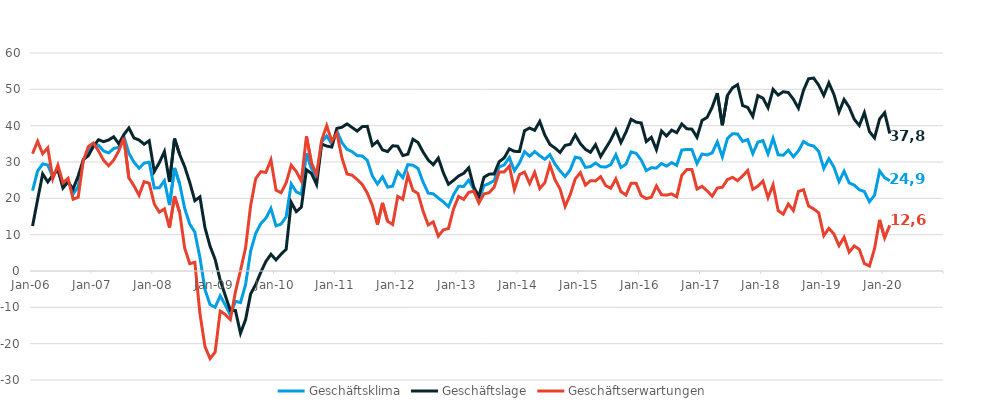
| Category | Geschäftsklima | Geschäftslage | Geschäftserwartungen |
|---|---|---|---|
| 2006-01-01 | 22.11 | 12.37 | 32.3 |
| 2006-02-01 | 27.53 | 19.65 | 35.69 |
| 2006-03-01 | 29.48 | 26.72 | 32.27 |
| 2006-04-01 | 29.16 | 24.52 | 33.9 |
| 2006-05-01 | 25.89 | 26.34 | 25.44 |
| 2006-06-01 | 28.5 | 27.9 | 29.12 |
| 2006-07-01 | 23.55 | 22.83 | 24.27 |
| 2006-08-01 | 25.02 | 24.53 | 25.5 |
| 2006-09-01 | 21.16 | 22.57 | 19.76 |
| 2006-10-01 | 23.19 | 26.13 | 20.29 |
| 2006-11-01 | 30.47 | 30.63 | 30.31 |
| 2006-12-01 | 33 | 31.75 | 34.25 |
| 2007-01-01 | 34.75 | 34.28 | 35.22 |
| 2007-02-01 | 34.59 | 36.13 | 33.07 |
| 2007-03-01 | 33.04 | 35.6 | 30.5 |
| 2007-04-01 | 32.49 | 36.05 | 28.98 |
| 2007-05-01 | 33.71 | 36.94 | 30.52 |
| 2007-06-01 | 34.04 | 35.02 | 33.06 |
| 2007-07-01 | 37.09 | 37.54 | 36.64 |
| 2007-08-01 | 32.38 | 39.37 | 25.6 |
| 2007-09-01 | 29.94 | 36.62 | 23.45 |
| 2007-10-01 | 28.31 | 36.05 | 20.83 |
| 2007-11-01 | 29.69 | 34.91 | 24.58 |
| 2007-12-01 | 29.93 | 35.86 | 24.15 |
| 2008-01-01 | 22.86 | 27.38 | 18.44 |
| 2008-02-01 | 22.9 | 29.82 | 16.19 |
| 2008-03-01 | 24.85 | 32.88 | 17.11 |
| 2008-04-01 | 18.14 | 24.52 | 11.94 |
| 2008-05-01 | 28.37 | 36.43 | 20.59 |
| 2008-06-01 | 23.98 | 32.09 | 16.15 |
| 2008-07-01 | 17.2 | 28.7 | 6.28 |
| 2008-08-01 | 12.89 | 24.35 | 2.01 |
| 2008-09-01 | 10.7 | 19.34 | 2.39 |
| 2008-10-01 | 3.72 | 20.4 | -11.7 |
| 2008-11-01 | -5.14 | 11.91 | -20.81 |
| 2008-12-01 | -9.26 | 6.82 | -24.1 |
| 2009-01-01 | -9.99 | 3.19 | -22.33 |
| 2009-02-01 | -6.84 | -2.53 | -11.05 |
| 2009-03-01 | -9.36 | -6.73 | -11.95 |
| 2009-04-01 | -12.11 | -10.86 | -13.35 |
| 2009-05-01 | -8.32 | -10.87 | -5.73 |
| 2009-06-01 | -8.7 | -17.14 | 0.14 |
| 2009-07-01 | -3.76 | -13.38 | 6.36 |
| 2009-08-01 | 5.5 | -6.3 | 18.03 |
| 2009-09-01 | 10.37 | -3.7 | 25.43 |
| 2009-10-01 | 13.04 | -0.36 | 27.34 |
| 2009-11-01 | 14.52 | 2.62 | 27.13 |
| 2009-12-01 | 17.21 | 4.6 | 30.59 |
| 2010-01-01 | 12.43 | 3.06 | 22.24 |
| 2010-02-01 | 12.91 | 4.62 | 21.53 |
| 2010-03-01 | 14.92 | 5.98 | 24.24 |
| 2010-04-01 | 23.96 | 18.91 | 29.13 |
| 2010-05-01 | 21.79 | 16.34 | 27.38 |
| 2010-06-01 | 21.13 | 17.58 | 24.73 |
| 2010-07-01 | 32.43 | 27.87 | 37.08 |
| 2010-08-01 | 28.26 | 26.83 | 29.7 |
| 2010-09-01 | 25.23 | 23.82 | 26.65 |
| 2010-10-01 | 35.47 | 34.94 | 36 |
| 2010-11-01 | 37.18 | 34.38 | 40.01 |
| 2010-12-01 | 34.94 | 34.12 | 35.76 |
| 2011-01-01 | 38.57 | 39.24 | 37.89 |
| 2011-02-01 | 35.33 | 39.56 | 31.16 |
| 2011-03-01 | 33.49 | 40.48 | 26.71 |
| 2011-04-01 | 32.85 | 39.51 | 26.36 |
| 2011-05-01 | 31.75 | 38.51 | 25.18 |
| 2011-06-01 | 31.65 | 39.73 | 23.84 |
| 2011-07-01 | 30.45 | 39.81 | 21.46 |
| 2011-08-01 | 26.15 | 34.55 | 18.05 |
| 2011-09-01 | 23.94 | 35.69 | 12.77 |
| 2011-10-01 | 25.92 | 33.33 | 18.75 |
| 2011-11-01 | 23.07 | 32.86 | 13.7 |
| 2011-12-01 | 23.37 | 34.47 | 12.8 |
| 2012-01-01 | 27.33 | 34.34 | 20.53 |
| 2012-02-01 | 25.68 | 31.77 | 19.75 |
| 2012-03-01 | 29.27 | 32.15 | 26.42 |
| 2012-04-01 | 29.13 | 36.28 | 22.19 |
| 2012-05-01 | 28.22 | 35.35 | 21.3 |
| 2012-06-01 | 24.46 | 32.74 | 16.47 |
| 2012-07-01 | 21.45 | 30.58 | 12.68 |
| 2012-08-01 | 21.24 | 29.25 | 13.52 |
| 2012-09-01 | 20.07 | 31.09 | 9.58 |
| 2012-10-01 | 19.03 | 27.01 | 11.34 |
| 2012-11-01 | 17.69 | 23.87 | 11.68 |
| 2012-12-01 | 20.98 | 24.95 | 17.08 |
| 2013-01-01 | 23.31 | 26.15 | 20.51 |
| 2013-02-01 | 23.27 | 26.88 | 19.71 |
| 2013-03-01 | 25.01 | 28.41 | 21.65 |
| 2013-04-01 | 22.51 | 23.04 | 21.98 |
| 2013-05-01 | 19.66 | 20.59 | 18.72 |
| 2013-06-01 | 23.49 | 25.8 | 21.21 |
| 2013-07-01 | 24.08 | 26.65 | 21.55 |
| 2013-08-01 | 24.86 | 26.72 | 23.01 |
| 2013-09-01 | 28.65 | 30.08 | 27.24 |
| 2013-10-01 | 29.2 | 31.14 | 27.27 |
| 2013-11-01 | 31.25 | 33.62 | 28.9 |
| 2013-12-01 | 27.61 | 32.93 | 22.41 |
| 2014-01-01 | 29.71 | 32.9 | 26.57 |
| 2014-02-01 | 32.86 | 38.63 | 27.22 |
| 2014-03-01 | 31.59 | 39.35 | 24.08 |
| 2014-04-01 | 32.87 | 38.73 | 27.15 |
| 2014-05-01 | 31.74 | 41.17 | 22.69 |
| 2014-06-01 | 30.76 | 37.41 | 24.29 |
| 2014-07-01 | 32.03 | 34.84 | 29.25 |
| 2014-08-01 | 29.45 | 33.85 | 25.12 |
| 2014-09-01 | 27.56 | 32.64 | 22.58 |
| 2014-10-01 | 26.01 | 34.57 | 17.77 |
| 2014-11-01 | 27.83 | 34.87 | 21 |
| 2014-12-01 | 31.33 | 37.46 | 25.35 |
| 2015-01-01 | 31.03 | 35.05 | 27.07 |
| 2015-02-01 | 28.51 | 33.49 | 23.63 |
| 2015-03-01 | 28.73 | 32.67 | 24.86 |
| 2015-04-01 | 29.72 | 34.77 | 24.79 |
| 2015-05-01 | 28.72 | 31.51 | 25.97 |
| 2015-06-01 | 28.59 | 33.79 | 23.51 |
| 2015-07-01 | 29.32 | 36.07 | 22.77 |
| 2015-08-01 | 32.01 | 38.87 | 25.35 |
| 2015-09-01 | 28.5 | 35.34 | 21.85 |
| 2015-10-01 | 29.41 | 38.22 | 20.92 |
| 2015-11-01 | 32.78 | 41.75 | 24.15 |
| 2015-12-01 | 32.39 | 40.95 | 24.14 |
| 2016-01-01 | 30.55 | 40.76 | 20.77 |
| 2016-02-01 | 27.64 | 35.63 | 19.92 |
| 2016-03-01 | 28.41 | 36.8 | 20.31 |
| 2016-04-01 | 28.34 | 33.41 | 23.39 |
| 2016-05-01 | 29.59 | 38.53 | 20.98 |
| 2016-06-01 | 28.88 | 37.17 | 20.88 |
| 2016-07-01 | 29.82 | 38.77 | 21.22 |
| 2016-08-01 | 29.07 | 38.06 | 20.42 |
| 2016-09-01 | 33.28 | 40.47 | 26.31 |
| 2016-10-01 | 33.47 | 39.14 | 27.94 |
| 2016-11-01 | 33.41 | 39.04 | 27.92 |
| 2016-12-01 | 29.57 | 36.8 | 22.55 |
| 2017-01-01 | 32.2 | 41.46 | 23.3 |
| 2017-02-01 | 31.93 | 42.27 | 22.04 |
| 2017-03-01 | 32.53 | 45.11 | 20.59 |
| 2017-04-01 | 35.54 | 48.96 | 22.83 |
| 2017-05-01 | 31.43 | 40.13 | 23.05 |
| 2017-06-01 | 36.46 | 48.33 | 25.16 |
| 2017-07-01 | 37.78 | 50.41 | 25.78 |
| 2017-08-01 | 37.71 | 51.29 | 24.87 |
| 2017-09-01 | 35.66 | 45.54 | 26.17 |
| 2017-10-01 | 36.18 | 45.01 | 27.67 |
| 2017-11-01 | 32.32 | 42.57 | 22.5 |
| 2017-12-01 | 35.47 | 48.27 | 23.34 |
| 2018-01-01 | 35.89 | 47.59 | 24.73 |
| 2018-02-01 | 32.23 | 44.94 | 20.19 |
| 2018-03-01 | 36.5 | 49.99 | 23.73 |
| 2018-04-01 | 31.98 | 48.42 | 16.62 |
| 2018-05-01 | 31.88 | 49.34 | 15.64 |
| 2018-06-01 | 33.27 | 49.12 | 18.43 |
| 2018-07-01 | 31.45 | 47.27 | 16.64 |
| 2018-08-01 | 33.07 | 44.81 | 21.9 |
| 2018-09-01 | 35.65 | 49.75 | 22.35 |
| 2018-10-01 | 34.74 | 52.91 | 17.88 |
| 2018-11-01 | 34.41 | 53.11 | 17.09 |
| 2018-12-01 | 32.91 | 51.14 | 16.01 |
| 2019-01-01 | 28.21 | 48.33 | 9.73 |
| 2019-02-01 | 30.89 | 51.78 | 11.73 |
| 2019-03-01 | 28.57 | 48.58 | 10.17 |
| 2019-04-01 | 24.62 | 43.78 | 6.96 |
| 2019-05-01 | 27.46 | 47.21 | 9.29 |
| 2019-06-01 | 24.25 | 45.09 | 5.18 |
| 2019-07-01 | 23.65 | 41.77 | 6.89 |
| 2019-08-01 | 22.35 | 40.05 | 5.95 |
| 2019-09-01 | 21.86 | 43.59 | 2.07 |
| 2019-10-01 | 19.08 | 38.36 | 1.36 |
| 2019-11-01 | 20.84 | 36.62 | 6.12 |
| 2019-12-01 | 27.54 | 41.85 | 14.07 |
| 2020-01-01 | 25.68 | 43.57 | 9.11 |
| 2020-02-01 | 24.85 | 37.84 | 12.57 |